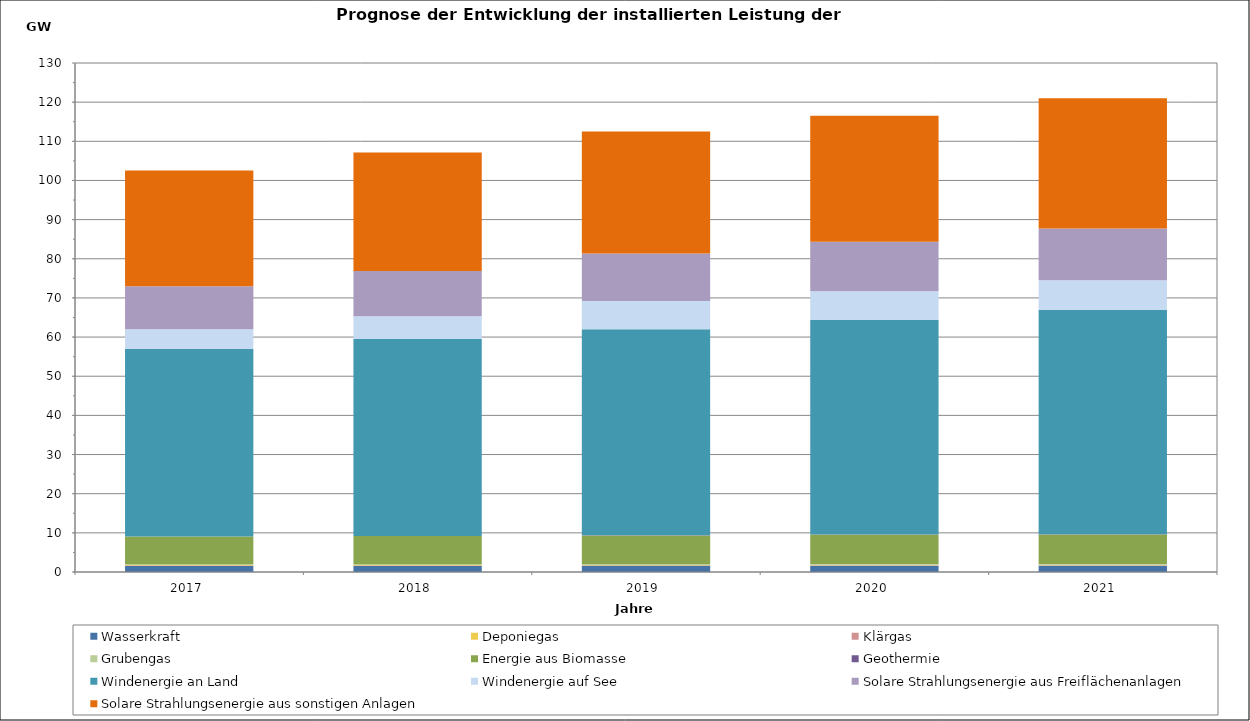
| Category | Wasserkraft | Deponiegas | Klärgas | Grubengas | Energie aus Biomasse | Geothermie | Windenergie an Land | Windenergie auf See | Solare Strahlungsenergie aus Freiflächenanlagen | Solare Strahlungsenergie aus sonstigen Anlagen |
|---|---|---|---|---|---|---|---|---|---|---|
| 2017.0 | 1545.83 | 182.246 | 80.752 | 221.099 | 7007.614 | 45.915 | 47884.525 | 5011.28 | 11023.321 | 29510.069 |
| 2018.0 | 1554.83 | 176.246 | 81.252 | 220.099 | 7141.214 | 51.915 | 50284.525 | 5782.28 | 11582.446 | 30298.069 |
| 2019.0 | 1564.83 | 171.246 | 81.752 | 219.099 | 7311.214 | 59.415 | 52584.525 | 7237.28 | 12113.446 | 31185.569 |
| 2020.0 | 1575.83 | 166.246 | 82.252 | 218.099 | 7451.214 | 66.915 | 54884.525 | 7237.28 | 12644.446 | 32172.569 |
| 2021.0 | 1587.83 | 161.246 | 82.752 | 217.099 | 7541.55 | 76.915 | 57284.525 | 7585.28 | 13175.446 | 33254.569 |